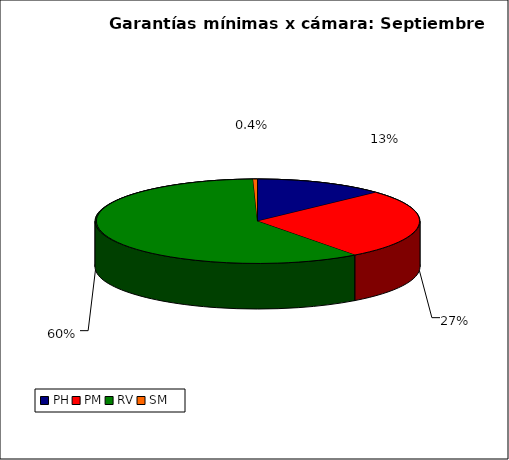
| Category | Series 0 |
|---|---|
| PH | 1917.207 |
| PM | 3938.601 |
| RV | 8796.59 |
| SM | 63.325 |